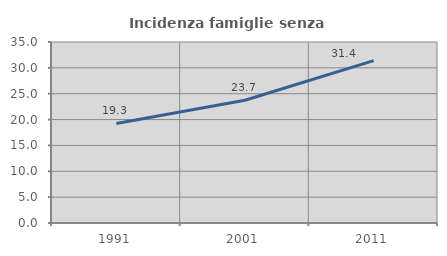
| Category | Incidenza famiglie senza nuclei |
|---|---|
| 1991.0 | 19.251 |
| 2001.0 | 23.731 |
| 2011.0 | 31.405 |